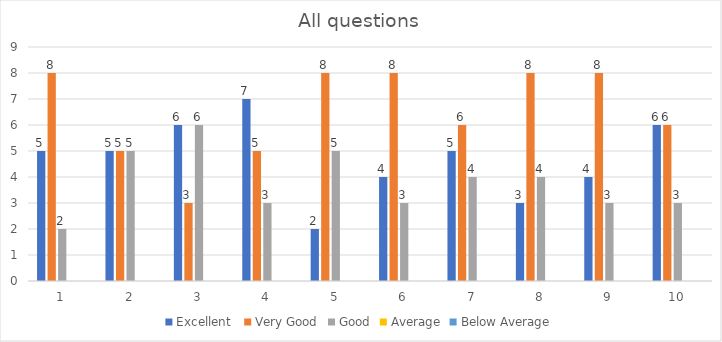
| Category | Excellent  | Very Good | Good | Average | Below Average |
|---|---|---|---|---|---|
| 0 | 5 | 8 | 2 | 0 | 0 |
| 1 | 5 | 5 | 5 | 0 | 0 |
| 2 | 6 | 3 | 6 | 0 | 0 |
| 3 | 7 | 5 | 3 | 0 | 0 |
| 4 | 2 | 8 | 5 | 0 | 0 |
| 5 | 4 | 8 | 3 | 0 | 0 |
| 6 | 5 | 6 | 4 | 0 | 0 |
| 7 | 3 | 8 | 4 | 0 | 0 |
| 8 | 4 | 8 | 3 | 0 | 0 |
| 9 | 6 | 6 | 3 | 0 | 0 |